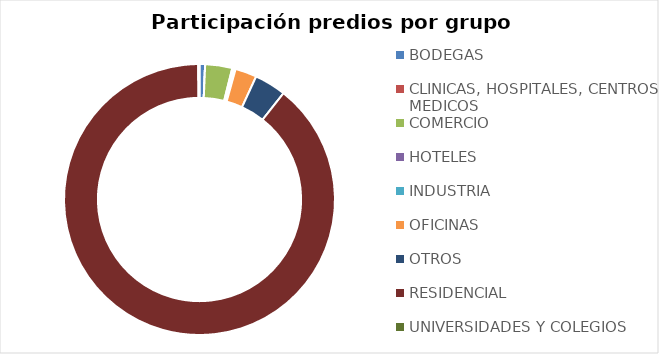
| Category | Series 0 |
|---|---|
| BODEGAS | 0.007 |
| CLINICAS, HOSPITALES, CENTROS MEDICOS | 0 |
| COMERCIO | 0.032 |
| HOTELES | 0.002 |
| INDUSTRIA | 0.002 |
| OFICINAS | 0.026 |
| OTROS | 0.038 |
| RESIDENCIAL | 0.892 |
| UNIVERSIDADES Y COLEGIOS | 0.001 |